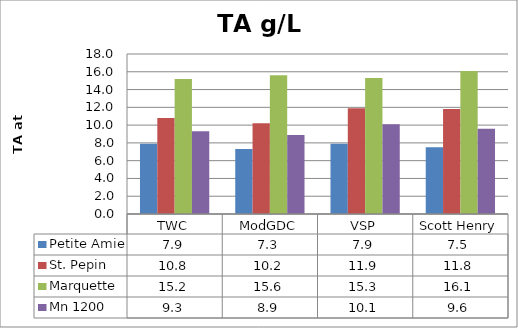
| Category | Petite Amie | St. Pepin | Marquette | Mn 1200 |
|---|---|---|---|---|
| 0 | 7.9 | 10.8 | 15.2 | 9.3 |
| 1 | 7.3 | 10.2 | 15.6 | 8.9 |
| 2 | 7.9 | 11.9 | 15.3 | 10.1 |
| 3 | 7.5 | 11.8 | 16.1 | 9.6 |